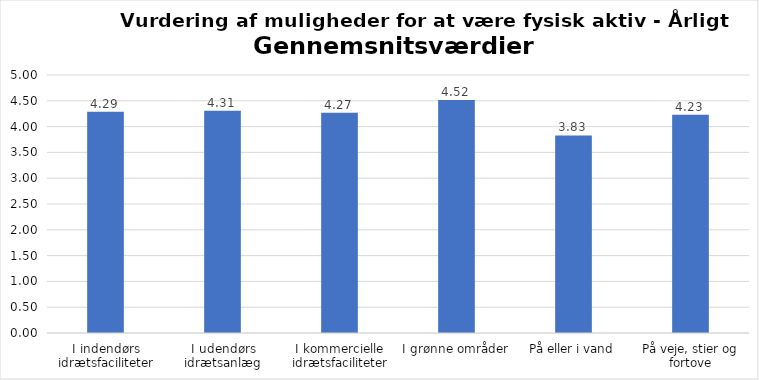
| Category | Gennemsnit |
|---|---|
| I indendørs idrætsfaciliteter | 4.288 |
| I udendørs idrætsanlæg | 4.309 |
| I kommercielle idrætsfaciliteter | 4.266 |
| I grønne områder | 4.517 |
| På eller i vand | 3.828 |
| På veje, stier og fortove | 4.229 |